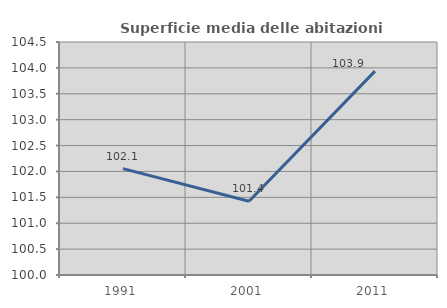
| Category | Superficie media delle abitazioni occupate |
|---|---|
| 1991.0 | 102.055 |
| 2001.0 | 101.423 |
| 2011.0 | 103.938 |